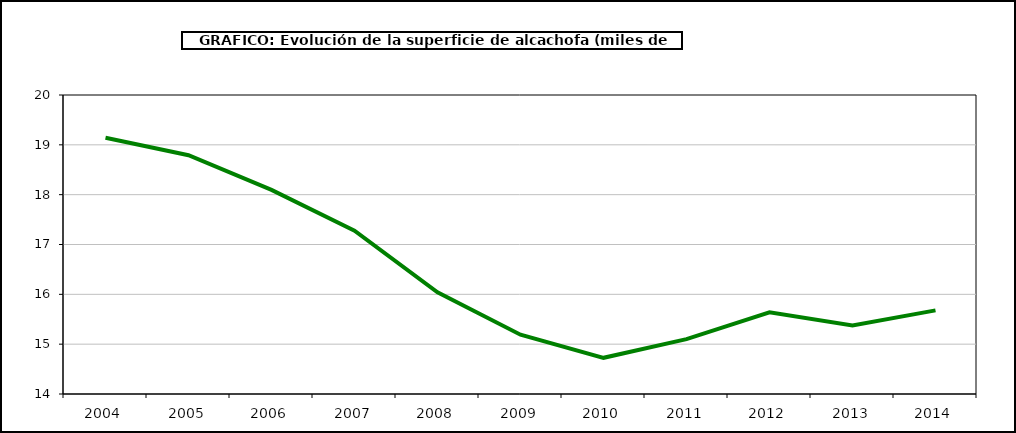
| Category | superficie |
|---|---|
| 2004.0 | 19.142 |
| 2005.0 | 18.792 |
| 2006.0 | 18.097 |
| 2007.0 | 17.277 |
| 2008.0 | 16.042 |
| 2009.0 | 15.19 |
| 2010.0 | 14.726 |
| 2011.0 | 15.1 |
| 2012.0 | 15.638 |
| 2013.0 | 15.376 |
| 2014.0 | 15.678 |